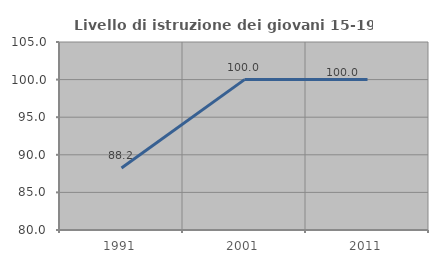
| Category | Livello di istruzione dei giovani 15-19 anni |
|---|---|
| 1991.0 | 88.235 |
| 2001.0 | 100 |
| 2011.0 | 100 |